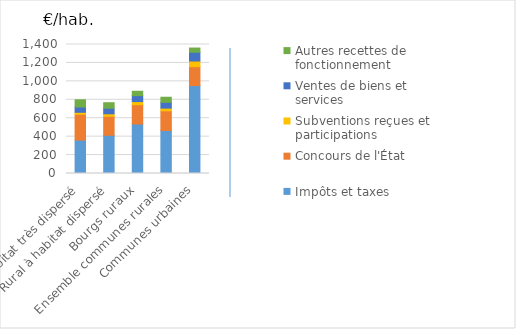
| Category | Impôts et taxes | Concours de l'État | Subventions reçues et participations | Ventes de biens et services | Autres recettes de fonctionnement |
|---|---|---|---|---|---|
| Rural à habitat très dispersé | 362.725 | 279.657 | 21.924 | 57.354 | 78.467 |
| Rural à habitat dispersé | 415.19 | 205.888 | 26.588 | 61.259 | 59.287 |
| Bourgs ruraux | 537.141 | 209.607 | 33.612 | 64.637 | 47.542 |
| Ensemble communes rurales | 466.503 | 213.708 | 29.408 | 62.477 | 55.517 |
| Communes urbaines | 954.089 | 205.027 | 61.685 | 95.256 | 45.57 |